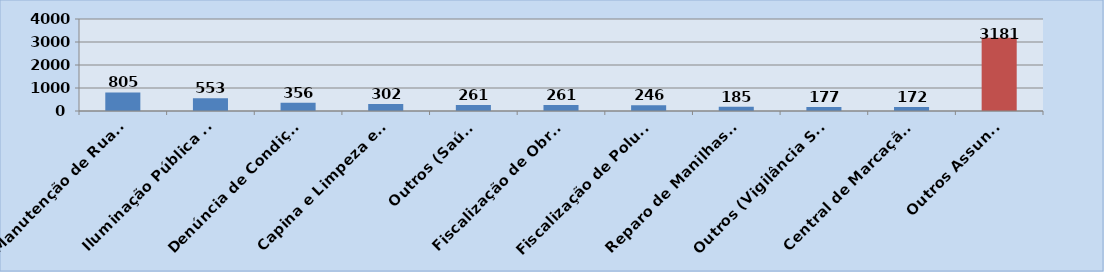
| Category | Quantidade |
|---|---|
| Manutenção de Ruas (Obras e Serviços Públicos) | 805 |
| Iluminação Pública (Obras e Serviços Públicos) | 553 |
| Denúncia de Condições Inadequadas de Criação (COPBEA) | 356 |
| Capina e Limpeza em Vias Públicas (Obras e Serviços Públicos) | 302 |
| Outros (Saúde) | 261 |
| Fiscalização de Obras Irregulares (Planejamento) | 261 |
| Fiscalização de Poluição Sonora (Meio Ambiente) | 246 |
| Reparo de Manilhas (Obras e Serviços Públicos) | 185 |
| Outros (Vigilância Sanitária) | 177 |
| Central de Marcação de Consultas (Saúde) | 172 |
| Outros Assuntos | 3181 |